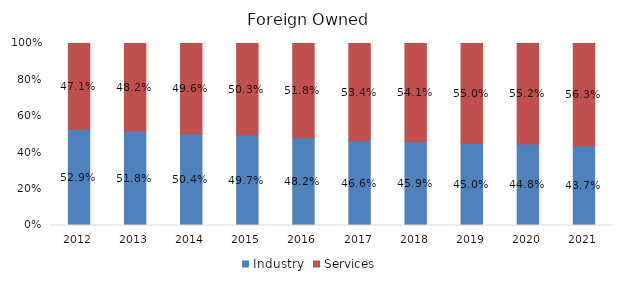
| Category | Industry | Services |
|---|---|---|
| 2012.0 | 0.529 | 0.471 |
| 2013.0 | 0.518 | 0.482 |
| 2014.0 | 0.504 | 0.496 |
| 2015.0 | 0.497 | 0.503 |
| 2016.0 | 0.482 | 0.518 |
| 2017.0 | 0.466 | 0.534 |
| 2018.0 | 0.459 | 0.541 |
| 2019.0 | 0.45 | 0.55 |
| 2020.0 | 0.448 | 0.552 |
| 2021.0 | 0.437 | 0.563 |